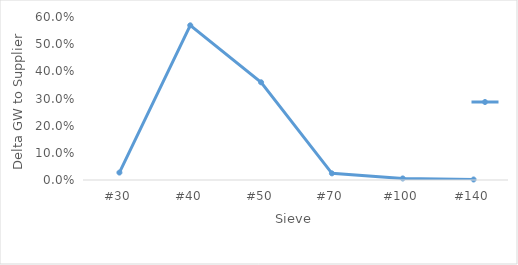
| Category | Series 0 |
|---|---|
| #30 | 0.027 |
| #40 | 0.569 |
| #50 | 0.36 |
| #70 | 0.024 |
| #100 | 0.006 |
| #140 | 0.002 |